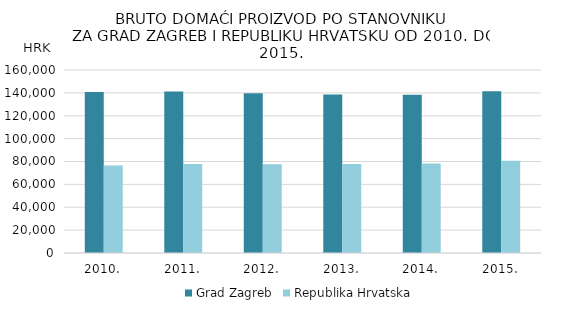
| Category | Grad Zagreb | Republika Hrvatska |
|---|---|---|
| 2010. | 140768 | 76563 |
| 2011. | 141309 | 77827 |
| 2012. | 139729 | 77517 |
| 2013. | 138532 | 77888 |
| 2014. | 138397 | 78201 |
| 2015. | 141379 | 80555 |